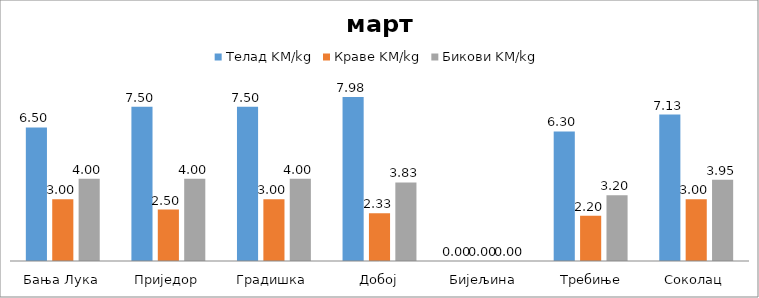
| Category | Телад KM/kg | Краве KM/kg | Бикови KM/kg |
|---|---|---|---|
| Бања Лука | 6.5 | 3 | 4 |
| Приједор | 7.5 | 2.5 | 4 |
| Градишка | 7.5 | 3 | 4 |
| Добој | 7.975 | 2.325 | 3.825 |
| Бијељина | 0 | 0 | 0 |
|  Требиње | 6.3 | 2.2 | 3.2 |
| Соколац | 7.125 | 3 | 3.95 |